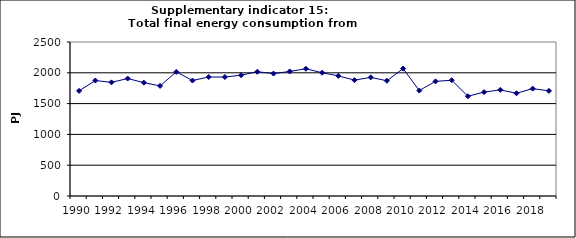
| Category | Total final energy consumption from households, PJ |
|---|---|
| 1990 | 1706.351 |
| 1991 | 1874.334 |
| 1992 | 1844.968 |
| 1993 | 1907.029 |
| 1994 | 1839.956 |
| 1995 | 1787.374 |
| 1996 | 2014.683 |
| 1997 | 1874.656 |
| 1998 | 1931.199 |
| 1999 | 1930.987 |
| 2000 | 1961.565 |
| 2001 | 2017.13 |
| 2002 | 1987.5 |
| 2003 | 2021.932 |
| 2004 | 2065.466 |
| 2005 | 2001.517 |
| 2006 | 1950.008 |
| 2007 | 1881.231 |
| 2008 | 1925.841 |
| 2009 | 1870.861 |
| 2010 | 2068.713 |
| 2011 | 1711.676 |
| 2012 | 1860.656 |
| 2013 | 1879.479 |
| 2014 | 1619.456 |
| 2015 | 1686.505 |
| 2016 | 1722.671 |
| 2017 | 1667.893 |
| 2018 | 1743.101 |
| 2019 | 1706.351 |